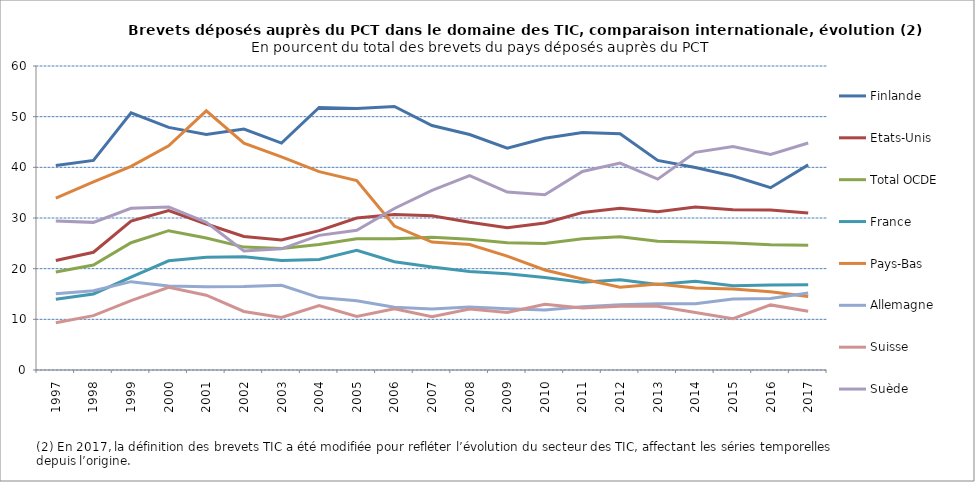
| Category | Finlande | Etats-Unis | Total OCDE | France | Pays-Bas | Allemagne | Suisse | Suède |
|---|---|---|---|---|---|---|---|---|
| 1997.0 | 40.365 | 21.611 | 19.337 | 13.97 | 33.912 | 15.026 | 9.316 | 29.425 |
| 1998.0 | 41.37 | 23.242 | 20.726 | 15.007 | 37.15 | 15.643 | 10.73 | 29.138 |
| 1999.0 | 50.768 | 29.401 | 25.118 | 18.324 | 40.178 | 17.437 | 13.693 | 31.919 |
| 2000.0 | 47.883 | 31.469 | 27.496 | 21.549 | 44.238 | 16.584 | 16.339 | 32.177 |
| 2001.0 | 46.474 | 28.818 | 26.065 | 22.243 | 51.155 | 16.45 | 14.769 | 29.147 |
| 2002.0 | 47.57 | 26.346 | 24.257 | 22.331 | 44.776 | 16.474 | 11.551 | 23.496 |
| 2003.0 | 44.793 | 25.656 | 23.989 | 21.601 | 42.074 | 16.717 | 10.367 | 23.921 |
| 2004.0 | 51.808 | 27.509 | 24.78 | 21.796 | 39.153 | 14.286 | 12.699 | 26.571 |
| 2005.0 | 51.617 | 29.985 | 25.881 | 23.613 | 37.369 | 13.686 | 10.568 | 27.576 |
| 2006.0 | 52.012 | 30.682 | 25.913 | 21.376 | 28.419 | 12.407 | 12.069 | 31.878 |
| 2007.0 | 48.255 | 30.429 | 26.222 | 20.317 | 25.243 | 12.053 | 10.531 | 35.467 |
| 2008.0 | 46.479 | 29.167 | 25.785 | 19.441 | 24.776 | 12.413 | 12.052 | 38.377 |
| 2009.0 | 43.773 | 28.093 | 25.105 | 19.01 | 22.464 | 12.113 | 11.344 | 35.114 |
| 2010.0 | 45.732 | 29.012 | 24.95 | 18.244 | 19.734 | 11.865 | 12.988 | 34.599 |
| 2011.0 | 46.883 | 31.083 | 25.915 | 17.317 | 17.958 | 12.481 | 12.238 | 39.184 |
| 2012.0 | 46.643 | 31.936 | 26.281 | 17.806 | 16.339 | 12.878 | 12.6 | 40.849 |
| 2013.0 | 41.365 | 31.221 | 25.416 | 16.877 | 16.954 | 13.1 | 12.587 | 37.673 |
| 2014.0 | 39.977 | 32.157 | 25.26 | 17.499 | 16.188 | 13.054 | 11.363 | 42.954 |
| 2015.0 | 38.278 | 31.62 | 25.078 | 16.624 | 15.987 | 14.023 | 10.128 | 44.112 |
| 2016.0 | 35.976 | 31.558 | 24.723 | 16.754 | 15.455 | 14.119 | 12.847 | 42.531 |
| 2017.0 | 40.491 | 31.009 | 24.611 | 16.839 | 14.527 | 15.19 | 11.576 | 44.801 |